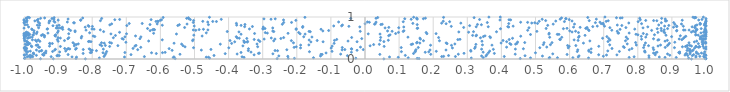
| Category | Series 0 |
|---|---|
| 0.9572621431923557 | 0.001 |
| 0.05534119699730821 | 0.002 |
| -0.8199984629012147 | 0.003 |
| 0.9995202873800365 | 0.004 |
| -0.9142506935684079 | 0.005 |
| -0.9514718917503007 | 0.006 |
| 0.9974810188023401 | 0.007 |
| -0.2577024510571608 | 0.008 |
| -0.556618720130417 | 0.009 |
| 0.1585824546775534 | 0.01 |
| 0.45535770207707815 | 0.011 |
| -0.8474251817822928 | 0.012 |
| -0.9985412994027729 | 0.013 |
| 0.15308573740996598 | 0.014 |
| -0.2068819496951637 | 0.015 |
| -0.22515771872652687 | 0.016 |
| 0.9996206349239484 | 0.017 |
| -0.026898225362138563 | 0.018 |
| 0.9489924767923402 | 0.019 |
| -0.4557990399982773 | 0.02 |
| -0.9968381194931668 | 0.021 |
| 0.311719893597773 | 0.022 |
| 0.6555140569759417 | 0.023 |
| 0.5398335868409191 | 0.024 |
| -0.7790167141851473 | 0.025 |
| 0.4853968988856794 | 0.026 |
| 0.8329995622989796 | 0.027 |
| 0.12671170478487248 | 0.028 |
| -0.1510653335395764 | 0.029 |
| 0.5643309474229027 | 0.03 |
| 0.6096164878335661 | 0.031 |
| 0.3467385661010236 | 0.032 |
| -0.5621544591313912 | 0.033 |
| 0.541589421955137 | 0.034 |
| -0.9812146959831469 | 0.035 |
| 0.9127348157637465 | 0.036 |
| 0.7747189100324388 | 0.037 |
| 0.8798961700759513 | 0.038 |
| -0.35475648962817824 | 0.039 |
| 0.09754217084527403 | 0.04 |
| 0.9952255628854978 | 0.041 |
| -0.4590935217253364 | 0.042 |
| -0.46545175786464965 | 0.043 |
| 0.9703691524638027 | 0.044 |
| -0.8459982546120757 | 0.045 |
| 0.8631038425606657 | 0.046 |
| -0.7052522242290095 | 0.047 |
| 0.07196295794452001 | 0.048 |
| 0.6252814420335093 | 0.049 |
| -0.8591406594602526 | 0.05 |
| -0.5602779164759877 | 0.051 |
| -0.360453630102967 | 0.052 |
| 0.7892258812143662 | 0.053 |
| -0.9745517267236534 | 0.054 |
| -0.9906197083429877 | 0.055 |
| -0.9203507265448798 | 0.056 |
| -0.646903441482326 | 0.057 |
| 0.22506882425620045 | 0.058 |
| 0.2651438866770396 | 0.059 |
| 0.4084950863620261 | 0.06 |
| -0.765370693139829 | 0.061 |
| 0.9819933377372321 | 0.062 |
| 0.23067985278411787 | 0.063 |
| -0.2263798043675577 | 0.064 |
| 0.9931507513395819 | 0.065 |
| 0.6989665757330684 | 0.066 |
| -0.9862302046578354 | 0.067 |
| 0.9707849062093155 | 0.068 |
| 0.35456866384704544 | 0.069 |
| 0.5203476800212629 | 0.07 |
| -0.13035459777707029 | 0.071 |
| 0.3419350724982086 | 0.072 |
| -0.25269098213567714 | 0.073 |
| -0.9771386600819271 | 0.074 |
| 0.6276695254153704 | 0.075 |
| 0.8325706183294665 | 0.076 |
| -0.9034174763789039 | 0.077 |
| 0.46929801053724685 | 0.078 |
| -0.051565393537138585 | 0.079 |
| -0.8965987511301413 | 0.08 |
| 0.9598426284292528 | 0.081 |
| 0.24507846440338363 | 0.082 |
| 0.9464128949798459 | 0.083 |
| -0.44273884610805175 | 0.084 |
| 0.9998454115180692 | 0.085 |
| 0.11816071205299451 | 0.086 |
| -0.9636295624189166 | 0.087 |
| -0.9010214458327074 | 0.088 |
| -0.9982220716203123 | 0.089 |
| 0.8937669347649296 | 0.09 |
| -0.9819671587808492 | 0.091 |
| -0.9419555413118705 | 0.092 |
| 0.9384165536702218 | 0.093 |
| 0.7082844667295864 | 0.094 |
| -0.9420086260800057 | 0.095 |
| -0.9994685476167983 | 0.096 |
| -0.7623762296365243 | 0.097 |
| 0.7387223029913803 | 0.098 |
| -0.3251758673666083 | 0.099 |
| 0.8512395852224793 | 0.1 |
| 0.685296997932402 | 0.101 |
| 0.9982141857972329 | 0.102 |
| 0.9637562703643159 | 0.103 |
| -0.6862103143476866 | 0.104 |
| 0.35754609502418805 | 0.105 |
| -0.8706161138232387 | 0.106 |
| -0.9453696605305849 | 0.107 |
| 0.5926790268488871 | 0.108 |
| -0.12565024061823862 | 0.109 |
| 0.043542753538489264 | 0.11 |
| 0.19284069360207332 | 0.111 |
| -0.12915006819732178 | 0.112 |
| -0.5425913435979365 | 0.113 |
| 0.2737199834185089 | 0.114 |
| 0.4404930951151407 | 0.115 |
| -0.071298637016949 | 0.116 |
| -0.9924528769974343 | 0.117 |
| -0.9713510483314726 | 0.118 |
| -0.3749791360907361 | 0.119 |
| 0.8872544334651621 | 0.12 |
| 0.9777843477283694 | 0.121 |
| 0.5506198954064319 | 0.122 |
| -0.27009749891834167 | 0.123 |
| 0.993418878634561 | 0.124 |
| 0.9531486274390437 | 0.125 |
| 0.940868447498453 | 0.126 |
| -0.40997193222985123 | 0.127 |
| 0.9431321345164898 | 0.128 |
| -0.7603272449968418 | 0.129 |
| -0.6119451522887562 | 0.13 |
| 0.14235140648999028 | 0.131 |
| -0.8265527416781447 | 0.132 |
| 0.37929634190424866 | 0.133 |
| -0.31236433111711737 | 0.134 |
| 0.29036747114454864 | 0.135 |
| -0.972868862680972 | 0.136 |
| 0.9227592993318768 | 0.137 |
| -0.9721164611085055 | 0.138 |
| -0.30979755595676545 | 0.139 |
| 0.9723925192877558 | 0.14 |
| 0.8461786558220056 | 0.141 |
| 0.9865661148345619 | 0.142 |
| -0.9360304406295027 | 0.143 |
| -0.1141571544025859 | 0.144 |
| 0.8519241528559922 | 0.145 |
| -0.9401755471232089 | 0.146 |
| 0.4998913101941259 | 0.147 |
| -0.625918588898917 | 0.148 |
| -0.7682248480119984 | 0.149 |
| 0.3620620233773593 | 0.15 |
| -0.5938581666410606 | 0.151 |
| -0.8055662411386552 | 0.152 |
| 0.920001591908735 | 0.153 |
| -0.7041608083175478 | 0.154 |
| 0.6628740189958733 | 0.155 |
| -0.36354530959556813 | 0.156 |
| -0.8021658306813811 | 0.157 |
| -0.5860762692448747 | 0.158 |
| 0.9537600115051641 | 0.159 |
| 0.1766274422699774 | 0.16 |
| -0.03987202896939215 | 0.161 |
| 0.8563170352595242 | 0.162 |
| 0.34648127335046836 | 0.163 |
| -0.33425820957679153 | 0.164 |
| 0.821578495126589 | 0.165 |
| 0.9718239090444167 | 0.166 |
| 0.922978777793143 | 0.167 |
| -0.8953412861157531 | 0.168 |
| -0.9926617549466421 | 0.169 |
| 0.1869208019142401 | 0.17 |
| 0.9963819424787363 | 0.171 |
| 0.14740117299225633 | 0.172 |
| 0.820326864535196 | 0.173 |
| -0.16290942182593696 | 0.174 |
| 0.10682342964325107 | 0.175 |
| -0.9884829152046428 | 0.176 |
| -0.757612778122947 | 0.177 |
| 0.622555561532839 | 0.178 |
| -0.9160685694277476 | 0.179 |
| 0.7460558802957944 | 0.18 |
| -0.955299626278478 | 0.181 |
| -0.09670600912972128 | 0.182 |
| 0.20912577177726413 | 0.183 |
| 0.6566411195241965 | 0.184 |
| 0.3105237777412303 | 0.185 |
| 0.1471956545579415 | 0.186 |
| -0.9814113728409917 | 0.187 |
| 0.36565334048631154 | 0.188 |
| -0.9355871329772594 | 0.189 |
| -0.8776684160876285 | 0.19 |
| 0.82027125465898 | 0.191 |
| 0.7120237489631649 | 0.192 |
| -0.9495643770878773 | 0.193 |
| -0.9949229534847889 | 0.194 |
| 0.9592677038581853 | 0.195 |
| 0.9532758746174064 | 0.196 |
| -0.2564357385468464 | 0.197 |
| -0.7875647809400783 | 0.198 |
| -0.34219940348926 | 0.199 |
| 0.9509050941630732 | 0.2 |
| -0.2637111333873561 | 0.201 |
| -0.9481172987998919 | 0.202 |
| 0.944397111368767 | 0.203 |
| -0.8025104654697219 | 0.204 |
| 0.30994841638339443 | 0.205 |
| -0.5655681994959229 | 0.206 |
| -0.023273390727435797 | 0.207 |
| 0.6562203964079246 | 0.208 |
| -0.7998275262046854 | 0.209 |
| 0.9622684671594106 | 0.21 |
| -0.9100422756089432 | 0.211 |
| -0.4799299348761272 | 0.212 |
| -0.9634958469426683 | 0.213 |
| 0.2375656135937732 | 0.214 |
| 0.19073269225785772 | 0.215 |
| -0.9972608774611622 | 0.216 |
| -0.06699351198309661 | 0.217 |
| 0.6239953065757169 | 0.218 |
| 0.7750812558286504 | 0.219 |
| -0.2291912249121834 | 0.22 |
| 0.1493870696416333 | 0.221 |
| -0.6665895399781707 | 0.222 |
| 0.8465748914977815 | 0.223 |
| -0.00510762154961699 | 0.224 |
| -0.05906881387085976 | 0.225 |
| -0.8261457716420446 | 0.226 |
| -0.8057617828842638 | 0.227 |
| -0.45177264734602407 | 0.228 |
| -0.9078064489243 | 0.229 |
| 0.3764017224461978 | 0.23 |
| 0.9525640115047929 | 0.231 |
| -0.8487884307483627 | 0.232 |
| -0.8731979885023605 | 0.233 |
| 0.3419559973519773 | 0.234 |
| -0.7673616616961231 | 0.235 |
| 0.4410011409381038 | 0.236 |
| 0.999999590147113 | 0.237 |
| -0.038729413262382925 | 0.238 |
| -0.8657954801573541 | 0.239 |
| -0.9941862418513964 | 0.24 |
| 0.6631804207122761 | 0.241 |
| -0.8088178049743168 | 0.242 |
| -0.04004575695559559 | 0.243 |
| 0.46443952998371624 | 0.244 |
| -0.3417020817332723 | 0.245 |
| -0.9924402684937378 | 0.246 |
| -0.5743769525823408 | 0.247 |
| 0.7827531933428706 | 0.248 |
| -0.8701245224720586 | 0.249 |
| 0.7243543581351282 | 0.25 |
| -0.8805247025755524 | 0.251 |
| -0.6802511544923968 | 0.252 |
| -0.8463562036925645 | 0.253 |
| 0.3215580157862929 | 0.254 |
| -0.9968156414530934 | 0.255 |
| 0.9461288706621573 | 0.256 |
| 0.9942870687380583 | 0.257 |
| 0.9664758727071568 | 0.258 |
| -0.9929871872888081 | 0.259 |
| -0.09920029934157355 | 0.26 |
| -0.9986130539849767 | 0.261 |
| -0.9996569169540318 | 0.262 |
| 0.25636031925428926 | 0.263 |
| -0.18898733742900492 | 0.264 |
| 0.5960438661717963 | 0.265 |
| -0.39940410454829284 | 0.266 |
| 0.8449724490289119 | 0.267 |
| 0.5126744393747382 | 0.268 |
| -0.5028044152281331 | 0.269 |
| 0.907544333804006 | 0.27 |
| 0.8168884200037851 | 0.271 |
| 0.10624247817555021 | 0.272 |
| -0.06662850043452309 | 0.273 |
| 0.1563041364896602 | 0.274 |
| 0.760448535125886 | 0.275 |
| 0.8803752738462158 | 0.276 |
| -0.20792034559598074 | 0.277 |
| -0.6575349521360883 | 0.278 |
| -0.9544769060795832 | 0.279 |
| 0.9775753315891499 | 0.28 |
| -0.9574635320371117 | 0.281 |
| 0.41523329723210634 | 0.282 |
| -0.013294657808079468 | 0.283 |
| 0.533026451942821 | 0.284 |
| -0.9969205532012051 | 0.285 |
| 0.32355446796124493 | 0.286 |
| 0.9999101067455365 | 0.287 |
| 0.981316912101273 | 0.288 |
| -0.5277092731972529 | 0.289 |
| -0.2016688339289548 | 0.29 |
| 0.9308410501367151 | 0.291 |
| -0.31476827453246614 | 0.292 |
| 0.9708732078022209 | 0.293 |
| -0.9772783719376498 | 0.294 |
| 0.7577851403299023 | 0.295 |
| 0.980568408933597 | 0.296 |
| 0.93962968581362 | 0.297 |
| -0.8933081396191943 | 0.298 |
| -0.7488194578743406 | 0.299 |
| 0.05616813177629684 | 0.3 |
| 0.9913471477088726 | 0.301 |
| 0.6855459341580245 | 0.302 |
| 0.5988312686215806 | 0.303 |
| 0.9706066807128366 | 0.304 |
| -0.6748816347840386 | 0.305 |
| -0.9251378936320153 | 0.306 |
| -0.09631032848797667 | 0.307 |
| 0.9573472669668976 | 0.308 |
| 0.8593251912524349 | 0.309 |
| 0.9426344458352846 | 0.31 |
| -0.9786717175013837 | 0.311 |
| -0.3580247719510298 | 0.312 |
| -0.8524318868621067 | 0.313 |
| 0.014996971148184894 | 0.314 |
| -0.7722699261252713 | 0.315 |
| -0.5335191129662691 | 0.316 |
| 0.8314774972057472 | 0.317 |
| -0.7246830050506758 | 0.318 |
| 0.8868776824570663 | 0.319 |
| 0.6183205768681699 | 0.32 |
| 0.5941511326059079 | 0.321 |
| -0.7613864323526712 | 0.322 |
| 0.946166774527335 | 0.323 |
| -0.6715127316243222 | 0.324 |
| 0.25360198629408875 | 0.325 |
| 0.9522762068915712 | 0.326 |
| -0.9640115777441424 | 0.327 |
| 0.19225637321275685 | 0.328 |
| 0.8192860838475944 | 0.329 |
| 0.37236465927471285 | 0.33 |
| -0.18874947674523748 | 0.331 |
| 0.8667205012916078 | 0.332 |
| 0.7956826287623231 | 0.333 |
| -0.9596725077331378 | 0.334 |
| -0.1645911217745493 | 0.335 |
| 0.34443315170391126 | 0.336 |
| 0.7176047918670712 | 0.337 |
| -0.776960365445813 | 0.338 |
| -0.9888340108434653 | 0.339 |
| -0.9926288872257839 | 0.34 |
| 0.5438020054770236 | 0.341 |
| 0.5228657953557574 | 0.342 |
| -0.8463253080218818 | 0.343 |
| 0.02530663584933686 | 0.344 |
| 0.8898409038523268 | 0.345 |
| 0.13560006459656582 | 0.346 |
| 0.42796776943933124 | 0.347 |
| 0.32527131029977463 | 0.348 |
| 0.04211550265062108 | 0.349 |
| -0.9964217091691182 | 0.35 |
| -0.8515590815097027 | 0.351 |
| 0.989816384271983 | 0.352 |
| -0.4242697272548619 | 0.353 |
| 0.44164138210943005 | 0.354 |
| -0.5377827763103884 | 0.355 |
| 0.13971927273364892 | 0.356 |
| -0.31659234602452974 | 0.357 |
| 0.2635285284168539 | 0.358 |
| 0.769068617609394 | 0.359 |
| -0.840799945007269 | 0.36 |
| 0.9917718090927122 | 0.361 |
| -0.9853167547573227 | 0.362 |
| -0.9879764397694469 | 0.363 |
| -0.9242333513261493 | 0.364 |
| 0.9776431848253396 | 0.365 |
| 0.24065101652850798 | 0.366 |
| 0.44500484477914204 | 0.367 |
| 0.42469580505859095 | 0.368 |
| -0.9168771691646525 | 0.369 |
| -0.9832990703234114 | 0.37 |
| -0.3911065904429181 | 0.371 |
| -0.09050706230390124 | 0.372 |
| -0.9247334848216293 | 0.373 |
| 0.9992420924185097 | 0.374 |
| 0.8927997147434807 | 0.375 |
| -0.559928575776401 | 0.376 |
| -0.7645209321200452 | 0.377 |
| 0.6406206516176318 | 0.378 |
| -0.7435523498779708 | 0.379 |
| 0.16088628599507504 | 0.38 |
| 0.39910213733458005 | 0.381 |
| 0.8224421000513538 | 0.382 |
| 0.23800448914480535 | 0.383 |
| 0.1515371018843997 | 0.384 |
| -0.20975318099475226 | 0.385 |
| 0.9502280034072041 | 0.386 |
| -0.7726249386811225 | 0.387 |
| -0.8562596509060056 | 0.388 |
| 0.5250733945175172 | 0.389 |
| 0.5484094290712951 | 0.39 |
| 0.4684353999897619 | 0.391 |
| 0.7936012191359691 | 0.392 |
| -0.748748351601622 | 0.393 |
| 0.9978205849417319 | 0.394 |
| 0.9991983388771964 | 0.395 |
| -0.35401381748424876 | 0.396 |
| 0.15319612208250444 | 0.397 |
| -0.7011900504337968 | 0.398 |
| 0.9085548109557803 | 0.399 |
| -0.3525875589904959 | 0.4 |
| -0.9887556782298753 | 0.401 |
| -0.3453317342436709 | 0.402 |
| 0.4474885303426061 | 0.403 |
| 0.988346355317071 | 0.404 |
| -0.9915998398759863 | 0.405 |
| -0.15862726155082954 | 0.406 |
| 0.9658499325380401 | 0.407 |
| 0.991546768749069 | 0.408 |
| -0.3820476065470073 | 0.409 |
| -0.12289977402563466 | 0.41 |
| -0.023242746190525816 | 0.411 |
| 0.4154413894877349 | 0.412 |
| -0.8036294314644206 | 0.413 |
| 0.055479681326966145 | 0.414 |
| -0.8108587782277532 | 0.415 |
| 0.7126791340031656 | 0.416 |
| -0.3441624816876934 | 0.417 |
| -0.30821527573194085 | 0.418 |
| -0.9631653311756472 | 0.419 |
| -0.8090231130648813 | 0.42 |
| -0.9534548825021575 | 0.421 |
| -0.8998443755712221 | 0.422 |
| 0.34303942921977215 | 0.423 |
| -0.9921839267151119 | 0.424 |
| 0.8798913175675805 | 0.425 |
| 0.9726604340108279 | 0.426 |
| -0.049747831159129154 | 0.427 |
| -0.6344505772069605 | 0.428 |
| -0.9976990154523337 | 0.429 |
| 0.6594705568781635 | 0.43 |
| -0.3554988704338105 | 0.431 |
| -0.26768676984185547 | 0.432 |
| 0.7638728171451071 | 0.433 |
| 0.2183715134688003 | 0.434 |
| 0.17147608930979125 | 0.435 |
| -0.5055566871512064 | 0.436 |
| -0.21592833149353516 | 0.437 |
| -0.8812377071891477 | 0.438 |
| -0.39581517672462374 | 0.439 |
| -0.14026142430067456 | 0.44 |
| 0.40480161185132824 | 0.441 |
| 0.6249258025830654 | 0.442 |
| -0.0894975366484633 | 0.443 |
| 0.8865646934541963 | 0.444 |
| 0.04490527675928083 | 0.445 |
| 0.06844298936378579 | 0.446 |
| 0.9899556972909856 | 0.447 |
| -0.3124739718882064 | 0.448 |
| -0.966331480908309 | 0.449 |
| 0.8587933232190101 | 0.45 |
| 0.7184365173318106 | 0.451 |
| -0.16380586880830414 | 0.452 |
| -0.9981122225148125 | 0.453 |
| -0.9580299798605129 | 0.454 |
| 0.6132724365992152 | 0.455 |
| -0.5944327832809713 | 0.456 |
| -0.9753583767272302 | 0.457 |
| -0.5041085140931006 | 0.458 |
| 0.8616442997526957 | 0.459 |
| 0.9291772125609098 | 0.46 |
| -0.9022620445958386 | 0.461 |
| 0.27227346834941535 | 0.462 |
| 0.57292736352791 | 0.463 |
| 0.4228052530602748 | 0.464 |
| -0.32492971239215607 | 0.465 |
| -0.08294140026637051 | 0.466 |
| 0.5710184248901478 | 0.467 |
| 0.2785412913071894 | 0.468 |
| 0.996477839292554 | 0.469 |
| 0.9901701064210212 | 0.47 |
| 0.811080299531311 | 0.471 |
| -0.7088809497239495 | 0.472 |
| 0.16263198764925704 | 0.473 |
| -0.2957700043007042 | 0.474 |
| -0.2640231711104746 | 0.475 |
| 0.921379635423538 | 0.476 |
| 0.9827583179905025 | 0.477 |
| 0.992690117915146 | 0.478 |
| 0.9876733216011566 | 0.479 |
| 0.7699970386611596 | 0.48 |
| 0.846105566322216 | 0.481 |
| 0.9988276265650338 | 0.482 |
| -0.8713243437513003 | 0.483 |
| -0.6600371447145875 | 0.484 |
| -0.009564447412791777 | 0.485 |
| -0.7122257991865525 | 0.486 |
| 0.7148348699939202 | 0.487 |
| -0.24675616726216643 | 0.488 |
| -0.3466005326177423 | 0.489 |
| 0.9335469570066024 | 0.49 |
| 0.9872478907540123 | 0.491 |
| -0.9994281022525114 | 0.492 |
| 0.4327247941317147 | 0.493 |
| 0.6968147829803611 | 0.494 |
| -0.36865428176154424 | 0.495 |
| -0.9895724587687642 | 0.496 |
| 0.16100477122429918 | 0.497 |
| -0.8933059329231061 | 0.498 |
| -0.9990012738558551 | 0.499 |
| -0.2748893197944124 | 0.5 |
| -0.8321347271689911 | 0.501 |
| -0.374715200002856 | 0.502 |
| -0.9868225349729028 | 0.503 |
| 0.985028713685246 | 0.504 |
| 0.33862544415845164 | 0.505 |
| -0.7379589837581624 | 0.506 |
| -0.8684240632162437 | 0.507 |
| -0.9001931712191797 | 0.508 |
| 0.36799333529668277 | 0.509 |
| -0.23852772329578514 | 0.51 |
| 0.2159084388102746 | 0.511 |
| -0.039136580389973474 | 0.512 |
| 0.045920509096568946 | 0.513 |
| -0.9822581958597745 | 0.514 |
| 0.6261209395688132 | 0.515 |
| 0.5770000385255577 | 0.516 |
| 0.5415786823857633 | 0.517 |
| -0.9761050163414839 | 0.518 |
| 0.937124438412879 | 0.519 |
| 0.1259843208598444 | 0.52 |
| 0.8233368897211056 | 0.521 |
| 0.7658709564732803 | 0.522 |
| -0.1555478803076308 | 0.523 |
| -0.9400703796180119 | 0.524 |
| 0.9835585796906137 | 0.525 |
| -0.998981259263293 | 0.526 |
| -0.6571615848696499 | 0.527 |
| -0.7038405110892206 | 0.528 |
| -0.1797066993391929 | 0.529 |
| -0.37744667673559973 | 0.53 |
| 0.36600337905641583 | 0.531 |
| 0.8991416884489296 | 0.532 |
| 0.7094239001454505 | 0.533 |
| 0.3471490609328508 | 0.534 |
| -0.7922618758157363 | 0.535 |
| 0.9941516781684209 | 0.536 |
| 0.9999905970108737 | 0.537 |
| -0.8307407554160054 | 0.538 |
| 0.8102458816705519 | 0.539 |
| -0.9943901393789027 | 0.54 |
| 0.9408303767692607 | 0.541 |
| 0.6281513688095623 | 0.542 |
| 0.45668755129679456 | 0.543 |
| -0.9982689187525032 | 0.544 |
| -0.907919819405207 | 0.545 |
| -0.7970191166996945 | 0.546 |
| -0.4776006981322152 | 0.547 |
| -0.9950803673814622 | 0.548 |
| -0.6728776235674471 | 0.549 |
| 0.3256105223715376 | 0.55 |
| 0.35187507561910947 | 0.551 |
| 0.9888205165648385 | 0.552 |
| 0.9247527694677783 | 0.553 |
| -0.9999862932719992 | 0.554 |
| 0.06950632138999577 | 0.555 |
| -0.9396842265383577 | 0.556 |
| 0.9988696000851538 | 0.557 |
| 0.993891311217719 | 0.558 |
| -0.909289332328173 | 0.559 |
| -0.7318363293441325 | 0.56 |
| -0.9489573120246841 | 0.561 |
| 0.3156185383437877 | 0.562 |
| 0.6452693050490788 | 0.563 |
| -0.9872233678909647 | 0.564 |
| 0.8827484823689671 | 0.565 |
| 0.3269681711339689 | 0.566 |
| 0.9771345108478955 | 0.567 |
| -0.5019914477643879 | 0.568 |
| -0.9738450231767175 | 0.569 |
| 0.9698941459946672 | 0.57 |
| -0.9958756845229398 | 0.571 |
| -0.9874331364176231 | 0.572 |
| -0.94346440796008 | 0.573 |
| -0.9723501877878336 | 0.574 |
| 0.07342541328841293 | 0.575 |
| 0.8003229213695994 | 0.576 |
| 0.8489359493848262 | 0.577 |
| -0.9066888583468644 | 0.578 |
| -0.9458533788988389 | 0.579 |
| -0.9994720423228941 | 0.58 |
| 0.9704430742007656 | 0.581 |
| -0.9911353634334338 | 0.582 |
| 0.4853801285012419 | 0.583 |
| -0.9829084918211607 | 0.584 |
| 0.8264426872452727 | 0.585 |
| 0.568783784548581 | 0.586 |
| 0.5639137809944098 | 0.587 |
| 0.9979304408580848 | 0.588 |
| 0.7945915569531519 | 0.589 |
| -0.3635241652318551 | 0.59 |
| 0.5394377190637459 | 0.591 |
| 0.9999250383173329 | 0.592 |
| -0.17562995138499854 | 0.593 |
| 0.044130344501300656 | 0.594 |
| -0.5529281031526999 | 0.595 |
| -0.9986275267202364 | 0.596 |
| -0.7450443759020084 | 0.597 |
| 0.0095329141834981 | 0.598 |
| -0.19020510664849546 | 0.599 |
| -0.6993367443891937 | 0.6 |
| -0.8688688866392227 | 0.601 |
| 0.18158425367196285 | 0.602 |
| -0.9634910032945108 | 0.603 |
| 0.20840325731592624 | 0.604 |
| -0.9999967361373331 | 0.605 |
| 0.08986346642796264 | 0.606 |
| -0.32378737173757277 | 0.607 |
| 0.8161750466928988 | 0.608 |
| -0.9870826946235818 | 0.609 |
| -0.9958122299481719 | 0.61 |
| -0.22567401635721546 | 0.611 |
| -0.6198563566213783 | 0.612 |
| 0.5400742914221232 | 0.613 |
| -0.99449672509697 | 0.614 |
| 0.7436965899007807 | 0.615 |
| -0.9298212944870603 | 0.616 |
| -0.2863678270354362 | 0.617 |
| 0.7746198246485622 | 0.618 |
| -0.9876707408549639 | 0.619 |
| 0.7415770907193564 | 0.62 |
| 0.9851275945668416 | 0.621 |
| -0.46545587515430925 | 0.622 |
| 0.8791259943226132 | 0.623 |
| -0.8075492392665866 | 0.624 |
| -0.9900065781490843 | 0.625 |
| -0.9707513817822568 | 0.626 |
| 0.9999980153212072 | 0.627 |
| -0.29235691469273783 | 0.628 |
| 0.6260613689842849 | 0.629 |
| -0.1944196081924617 | 0.63 |
| 0.17935348014674904 | 0.631 |
| -0.9015924911362457 | 0.632 |
| 0.8588419800879441 | 0.633 |
| 0.09825548033369273 | 0.634 |
| -0.7197590291899778 | 0.635 |
| 0.9929605163513899 | 0.636 |
| 0.9997514549893248 | 0.637 |
| 0.30391009297147814 | 0.638 |
| 0.968359488690651 | 0.639 |
| -0.9931047874315663 | 0.64 |
| 0.9573503455943734 | 0.641 |
| -0.9614973736177743 | 0.642 |
| 0.6072312971938292 | 0.643 |
| 0.27516019594782276 | 0.644 |
| -0.36961957868238887 | 0.645 |
| 0.9957772154643987 | 0.646 |
| 0.8762793137143786 | 0.647 |
| 0.38572174576452894 | 0.648 |
| -0.8501113323688759 | 0.649 |
| -0.16041479680268983 | 0.65 |
| 0.31821249722956424 | 0.651 |
| -0.7665380552118486 | 0.652 |
| -0.26744011291494896 | 0.653 |
| -0.40395812920832014 | 0.654 |
| 0.9998962642984389 | 0.655 |
| 0.11195814393989008 | 0.656 |
| -0.16407015003515096 | 0.657 |
| 0.5041195609157817 | 0.658 |
| -0.013931251321553786 | 0.659 |
| 0.07955823746656697 | 0.66 |
| 0.6175595693183586 | 0.661 |
| 0.7397787335168922 | 0.662 |
| 0.9991751040116068 | 0.663 |
| 0.9626439889585244 | 0.664 |
| -0.2704403217014251 | 0.665 |
| -0.8994918433546482 | 0.666 |
| 0.06619772632816452 | 0.667 |
| -0.12357920367539318 | 0.668 |
| 0.9138776893406653 | 0.669 |
| 0.6002891827131546 | 0.67 |
| -0.8502809893835689 | 0.671 |
| 0.11419839490638709 | 0.672 |
| 0.9707840324020759 | 0.673 |
| -0.9707974941643646 | 0.674 |
| -0.6300696305694664 | 0.675 |
| 0.8691412076156424 | 0.676 |
| 0.6569540971524993 | 0.677 |
| -0.1065856523249965 | 0.678 |
| -0.863360013799751 | 0.679 |
| 0.9143829174557306 | 0.68 |
| 0.8405788920725604 | 0.681 |
| 0.9973184970596687 | 0.682 |
| -0.49625623646316663 | 0.683 |
| 0.4770168299659264 | 0.684 |
| 0.7237701347469491 | 0.685 |
| 0.999847182924322 | 0.686 |
| -0.818082776108899 | 0.687 |
| 0.93841468631097 | 0.688 |
| 0.9504471486840433 | 0.689 |
| 0.934136626204323 | 0.69 |
| -0.5035311781759337 | 0.691 |
| -0.4607147616678752 | 0.692 |
| -0.7762859293328384 | 0.693 |
| 0.9962977038055345 | 0.694 |
| 0.8774297019164019 | 0.695 |
| -0.6229296660262882 | 0.696 |
| 0.655170241965581 | 0.697 |
| -0.6172176272497146 | 0.698 |
| 0.9716013959994553 | 0.699 |
| -0.48632033901648436 | 0.7 |
| -0.9759592914256665 | 0.701 |
| 0.9737803183729719 | 0.702 |
| -0.6195723479874368 | 0.703 |
| -0.20188655309866899 | 0.704 |
| 0.7480142482827294 | 0.705 |
| -0.8863849405646933 | 0.706 |
| -0.47384693105633463 | 0.707 |
| -0.12892788707546887 | 0.708 |
| -0.8685018484821113 | 0.709 |
| -0.7946022985124656 | 0.71 |
| 0.7910877567907209 | 0.711 |
| -0.9321992140632251 | 0.712 |
| -0.9773324404956285 | 0.713 |
| -0.8007055864222808 | 0.714 |
| -0.3388726009270255 | 0.715 |
| -0.29888976943696505 | 0.716 |
| -0.29960526634997786 | 0.717 |
| -0.9309785668737935 | 0.718 |
| -0.20181479403445804 | 0.719 |
| 0.39736186185592626 | 0.72 |
| 0.8570674984751794 | 0.721 |
| 0.5818326397196526 | 0.722 |
| 0.9859321840957869 | 0.723 |
| 0.8872985593854047 | 0.724 |
| -0.293282196021674 | 0.725 |
| -0.637723835967419 | 0.726 |
| 0.5312138728406676 | 0.727 |
| 0.8683991012746965 | 0.728 |
| 0.15304880601904233 | 0.729 |
| 0.5924161570815973 | 0.73 |
| 0.6474176406446389 | 0.731 |
| 0.6490083859355344 | 0.732 |
| 0.997653794721981 | 0.733 |
| 0.15469831189096686 | 0.734 |
| -0.9998690717822449 | 0.735 |
| -0.9053490947485626 | 0.736 |
| -0.8941997705308015 | 0.737 |
| -0.9009598566208642 | 0.738 |
| -0.27052077157307003 | 0.739 |
| 0.05889170872860997 | 0.74 |
| 0.8153153528592908 | 0.741 |
| -0.8889901243755222 | 0.742 |
| -0.9571518362861051 | 0.743 |
| 0.48090331375679557 | 0.744 |
| 0.09892272158311151 | 0.745 |
| 0.7180768809935573 | 0.746 |
| 0.9670887267561777 | 0.747 |
| 0.7651315906559107 | 0.748 |
| 0.6512968230437582 | 0.749 |
| -0.5289565162525797 | 0.75 |
| 0.2893274204251777 | 0.751 |
| -0.1829040239426584 | 0.752 |
| 0.06979463585993909 | 0.753 |
| 0.6309311102733818 | 0.754 |
| 0.9678601857072404 | 0.755 |
| -0.8872298464509544 | 0.756 |
| 0.9048848020980662 | 0.757 |
| -0.8205112310395793 | 0.758 |
| 0.6116247583052332 | 0.759 |
| -0.2983965642158948 | 0.76 |
| 0.4214255101839883 | 0.761 |
| 0.11375020616087993 | 0.762 |
| -0.9865696858022197 | 0.763 |
| -0.015229670283674127 | 0.764 |
| 0.8293913559153219 | 0.765 |
| 0.95932226602399 | 0.766 |
| 0.326122885421325 | 0.767 |
| 0.3614397668998164 | 0.768 |
| -0.3529512769028991 | 0.769 |
| 0.41880471266370517 | 0.77 |
| 0.6679738015004061 | 0.771 |
| 0.9137425039648619 | 0.772 |
| -0.3302028390570109 | 0.773 |
| -0.18243522393490946 | 0.774 |
| -0.7993905861637032 | 0.775 |
| -0.8096079152913555 | 0.776 |
| 0.2530513294179753 | 0.777 |
| -0.04724662260352148 | 0.778 |
| 0.9145311418389389 | 0.779 |
| 0.9335430252496207 | 0.78 |
| 0.7024581894419691 | 0.781 |
| 0.4344077527162431 | 0.782 |
| 0.6811713998675639 | 0.783 |
| 0.8786581868144778 | 0.784 |
| -0.5008749522597596 | 0.785 |
| 0.9999786874053758 | 0.786 |
| -0.09170225587308413 | 0.787 |
| 0.9989185898015658 | 0.788 |
| -0.0686125004597821 | 0.789 |
| 0.9998736363468806 | 0.79 |
| -0.9032518249668351 | 0.791 |
| -0.9150161411244686 | 0.792 |
| 0.9688128458443441 | 0.793 |
| 0.3068653940841497 | 0.794 |
| -0.8116391476202149 | 0.795 |
| -0.6984199033914595 | 0.796 |
| -0.5489223167792983 | 0.797 |
| 0.7532107657334018 | 0.798 |
| 0.8909141017737569 | 0.799 |
| -0.36338684357348905 | 0.8 |
| 0.5358111178317024 | 0.801 |
| -0.8969069512998141 | 0.802 |
| -0.9544888820406756 | 0.803 |
| -0.5943524829253735 | 0.804 |
| -0.9606857558374929 | 0.805 |
| -0.3763037412525898 | 0.806 |
| 0.9951783347578232 | 0.807 |
| 0.7399002876168197 | 0.808 |
| -0.06615320981495917 | 0.809 |
| 0.9733519029582318 | 0.81 |
| 0.8613744333215191 | 0.811 |
| -0.7483894549280002 | 0.812 |
| 0.9977287703990528 | 0.813 |
| -0.9970039862967215 | 0.814 |
| -0.9904595530641431 | 0.815 |
| 0.34134797120661486 | 0.816 |
| -0.5444352067230053 | 0.817 |
| -0.4591363675969777 | 0.818 |
| 0.15313084490733053 | 0.819 |
| -0.630449971072431 | 0.82 |
| 0.046525066550753266 | 0.821 |
| -0.3520217045483233 | 0.822 |
| 0.3298288117569178 | 0.823 |
| 0.9088696965221089 | 0.824 |
| 0.6990403472470526 | 0.825 |
| 0.9824473879055731 | 0.826 |
| -0.24242989956226021 | 0.827 |
| 0.05050830176544898 | 0.828 |
| 0.028082583305660016 | 0.829 |
| 0.5518640060017976 | 0.83 |
| 0.6143849220992182 | 0.831 |
| -0.5218270187555829 | 0.832 |
| 0.9280965328537139 | 0.833 |
| 0.9961681697604695 | 0.834 |
| -0.6094407939590137 | 0.835 |
| -0.7429805296760421 | 0.836 |
| 0.9836957959930984 | 0.837 |
| 0.00023502737750690324 | 0.838 |
| 0.030142490615413194 | 0.839 |
| 0.23788739362376696 | 0.84 |
| 0.8110794363567543 | 0.841 |
| 0.6926574247053349 | 0.842 |
| 0.4215214038549639 | 0.843 |
| 0.9973050782388765 | 0.844 |
| -0.6914724330297926 | 0.845 |
| -0.6533707997379454 | 0.846 |
| 0.5059856713848606 | 0.847 |
| 0.140329526417034 | 0.848 |
| -0.3771176832363726 | 0.849 |
| 0.9826179750900792 | 0.85 |
| 0.6981159854889242 | 0.851 |
| -0.9543916178691254 | 0.852 |
| 0.22479067235297737 | 0.853 |
| 0.28105397125007187 | 0.854 |
| 0.998956952442838 | 0.855 |
| 0.4889895509165016 | 0.856 |
| 0.7736758355619887 | 0.857 |
| 0.998361187438854 | 0.858 |
| -0.9268301540970167 | 0.859 |
| -0.9998886985477151 | 0.86 |
| -0.8523365934441267 | 0.861 |
| 0.4979589368827266 | 0.862 |
| -0.8544819603784961 | 0.863 |
| 0.8690461194117031 | 0.864 |
| 0.6756741315094478 | 0.865 |
| 0.9053999970177015 | 0.866 |
| -0.9992405027469831 | 0.867 |
| 0.35872541665697794 | 0.868 |
| -0.2384443975573699 | 0.869 |
| -0.5036312552619148 | 0.87 |
| -0.215389878127117 | 0.871 |
| 0.47690332088898724 | 0.872 |
| -0.998023878333033 | 0.873 |
| 0.012775591891668514 | 0.874 |
| 0.45644138612645957 | 0.875 |
| -0.9092223284204153 | 0.876 |
| 0.6890101117104734 | 0.877 |
| 0.032437816706320004 | 0.878 |
| -0.4611819930956668 | 0.879 |
| -0.8728712344154265 | 0.88 |
| -0.07737027344451206 | 0.881 |
| 0.00721337042907792 | 0.882 |
| -0.9586333437180412 | 0.883 |
| -0.9920845872066204 | 0.884 |
| -0.9963524235131264 | 0.885 |
| 0.9994116260594139 | 0.886 |
| 0.11210042486003055 | 0.887 |
| 0.24821901999743545 | 0.888 |
| 0.8010542069209288 | 0.889 |
| 0.99997884139094 | 0.89 |
| 0.5848272482748345 | 0.891 |
| -0.4356953405100144 | 0.892 |
| -0.6066822915906461 | 0.893 |
| -0.4464757223826017 | 0.894 |
| -0.6128739248852134 | 0.895 |
| 0.7073038382635 | 0.896 |
| -0.4756707596604612 | 0.897 |
| 0.5108777442890866 | 0.898 |
| -0.6075927807940114 | 0.899 |
| 0.22959329640961348 | 0.9 |
| -0.9123624489345078 | 0.901 |
| -0.9260083595510394 | 0.902 |
| 0.5594779451160565 | 0.903 |
| 0.8810039729962166 | 0.904 |
| 0.6071772818046606 | 0.905 |
| -0.9915662632694836 | 0.906 |
| -0.9681205741771339 | 0.907 |
| -0.9237368248013154 | 0.908 |
| 0.8842511434426469 | 0.909 |
| 0.7132130143753966 | 0.91 |
| 0.855870229130507 | 0.911 |
| -0.7759272932098942 | 0.912 |
| 0.6576241931841358 | 0.913 |
| 0.5298534560339576 | 0.914 |
| 0.8464124552611928 | 0.915 |
| -0.5025816621256282 | 0.916 |
| -0.9997618901384213 | 0.917 |
| 0.8231929176451377 | 0.918 |
| -0.9916846933173007 | 0.919 |
| -0.20274869421084782 | 0.92 |
| -0.8338020990801787 | 0.921 |
| -0.6001702846897077 | 0.922 |
| 0.9303485526455171 | 0.923 |
| 0.9999755519903885 | 0.924 |
| -0.8997068690208592 | 0.925 |
| -0.9611217390234664 | 0.926 |
| 0.9786381462103669 | 0.927 |
| 0.39572192343462675 | 0.928 |
| -0.8337615086384008 | 0.929 |
| -0.23893206552519672 | 0.93 |
| 0.4271509827487318 | 0.931 |
| -0.5967661111958278 | 0.932 |
| 0.807345620986078 | 0.933 |
| 0.42230781537993317 | 0.934 |
| -0.7336655666076957 | 0.935 |
| -0.999890092729013 | 0.936 |
| -0.6272027323567014 | 0.937 |
| 0.5987870961538724 | 0.938 |
| -0.5121322507912455 | 0.939 |
| 0.3360382354612357 | 0.94 |
| -0.7195355116433904 | 0.941 |
| 0.9881668065365795 | 0.942 |
| -0.9585664765002673 | 0.943 |
| -0.4214332753384839 | 0.944 |
| 0.1354659900738733 | 0.945 |
| 0.5196108696761365 | 0.946 |
| -0.2755677998576708 | 0.947 |
| 0.5723141751220141 | 0.948 |
| 0.6784355557691154 | 0.949 |
| -0.9121027010479449 | 0.95 |
| 0.15315123193684155 | 0.951 |
| -0.8706862606994759 | 0.952 |
| 0.8803654824284775 | 0.953 |
| 0.1524614676198886 | 0.954 |
| -0.29626310269774586 | 0.955 |
| -0.2632652700478206 | 0.956 |
| 0.5886920290115616 | 0.957 |
| 0.1166505077449011 | 0.958 |
| 0.1711840043160035 | 0.959 |
| -0.5168014592532169 | 0.96 |
| 0.9999988147850339 | 0.961 |
| -0.9922315002390844 | 0.962 |
| 0.5894555907181129 | 0.963 |
| -0.9179364347039716 | 0.964 |
| -0.7722725365623151 | 0.965 |
| -0.041829791963670496 | 0.966 |
| 0.8699037786778203 | 0.967 |
| -0.5229072259962 | 0.968 |
| -0.9512351771559756 | 0.969 |
| 0.03239051275286943 | 0.97 |
| 0.8056436941804841 | 0.971 |
| 0.17718490504778928 | 0.972 |
| 0.1514726791828174 | 0.973 |
| -0.993361750524676 | 0.974 |
| -0.8279008709316588 | 0.975 |
| 0.7484640511514857 | 0.976 |
| -0.9394836734125013 | 0.977 |
| 0.5763980983312259 | 0.978 |
| 0.9661815405785609 | 0.979 |
| 0.7540156676378325 | 0.98 |
| -0.5179686179862902 | 0.981 |
| 0.7374874445512409 | 0.982 |
| -0.9841298851230149 | 0.983 |
| 0.31995015955765127 | 0.984 |
| -0.9116819019543159 | 0.985 |
| 0.9700947414166485 | 0.986 |
| 0.03720680664035561 | 0.987 |
| -0.5919711161803772 | 0.988 |
| 0.6532841143644097 | 0.989 |
| 0.9680923596768467 | 0.99 |
| 0.23034486253458084 | 0.991 |
| -0.17617234236281218 | 0.992 |
| -0.45612119549399877 | 0.993 |
| 0.14270874529690922 | 0.994 |
| -0.9882378834101506 | 0.995 |
| 0.9618237833792959 | 0.996 |
| 0.9922530242932118 | 0.997 |
| 0.36335161668955335 | 0.998 |
| 0.3967103914572033 | 0.999 |
| 0.703707202851938 | 1 |